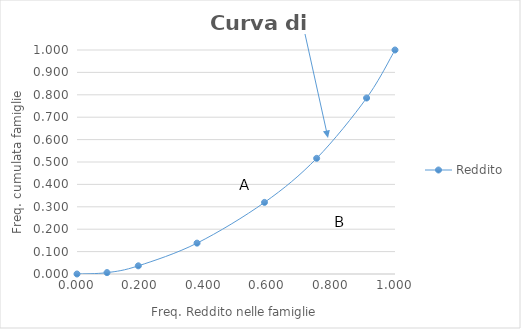
| Category | Reddito |
|---|---|
| 0.0 | 0 |
| 0.09440523678019842 | 0.006 |
| 0.1927994272271658 | 0.036 |
| 0.37751866625754327 | 0.138 |
| 0.5896491766390509 | 0.32 |
| 0.7536054004295797 | 0.516 |
| 0.9107088063823259 | 0.786 |
| 1.0 | 1 |